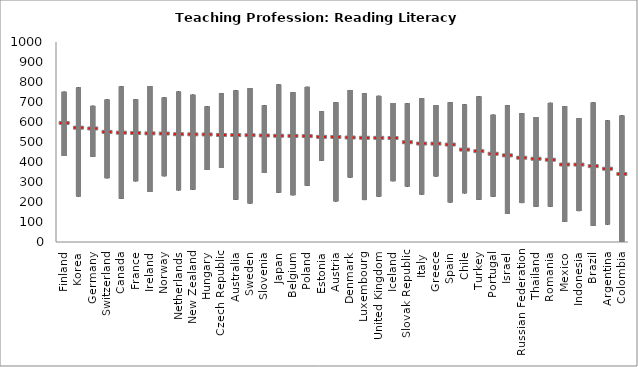
| Category | min | mean | max |
|---|---|---|---|
| Finland | 430.296 | 597.797 | 750.885 |
| Korea | 228.076 | 574.198 | 772.702 |
| Germany | 425.647 | 570.22 | 680.671 |
| Switzerland | 319.209 | 553.107 | 711.909 |
| Canada | 216.814 | 549.109 | 777.356 |
| France | 304.1 | 547.442 | 713.672 |
| Ireland | 250.053 | 545.571 | 779.469 |
| Norway | 329.26 | 544.783 | 722.06 |
| Netherlands | 258.816 | 541.395 | 751.695 |
| New Zealand | 262.058 | 540.765 | 736.1 |
| Hungary | 360.561 | 540.195 | 678.011 |
| Czech Republic | 370.105 | 537.622 | 743.494 |
| Australia | 212.076 | 537.134 | 757.638 |
| Sweden | 193.265 | 536.281 | 769.313 |
| Slovenia | 344.9 | 535.004 | 682.744 |
| Japan | 247.175 | 533.696 | 787.016 |
| Belgium | 234.186 | 533.146 | 749.366 |
| Poland | 281.588 | 531.958 | 775.59 |
| Estonia | 406.257 | 528.248 | 654.168 |
| Austria | 203.649 | 527.713 | 698.376 |
| Denmark | 322.947 | 524.964 | 760.148 |
| Luxembourg | 209.826 | 523.531 | 744.227 |
| United Kingdom | 227.721 | 523.34 | 730.563 |
| Iceland | 304.348 | 522.571 | 694.908 |
| Slovak Republic | 277.805 | 501.492 | 693.541 |
| Italy | 237.937 | 494.82 | 718.964 |
| Greece | 328.495 | 494.478 | 684.582 |
| Spain | 198.437 | 489.799 | 698.435 |
| Chile | 243.911 | 464.488 | 687.996 |
| Turkey | 211.096 | 456.645 | 727.928 |
| Portugal | 227.1 | 443.687 | 635.975 |
| Israel | 141.023 | 435.681 | 683.865 |
| Russian Federation | 194.799 | 423.929 | 643.967 |
| Thailand | 176.581 | 418.643 | 624.952 |
| Romania | 177.576 | 413.868 | 695.607 |
| Mexico | 100.824 | 389.978 | 679.263 |
| Indonesia | 154.726 | 389.619 | 620.126 |
| Brazil | 80.888 | 381.906 | 697.058 |
| Argentina | 88.036 | 368.85 | 607.708 |
| Colombia | 1.02 | 342.75 | 632.001 |